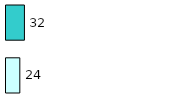
| Category | Series 0 | Series 1 |
|---|---|---|
| 0 | 24 | 32 |